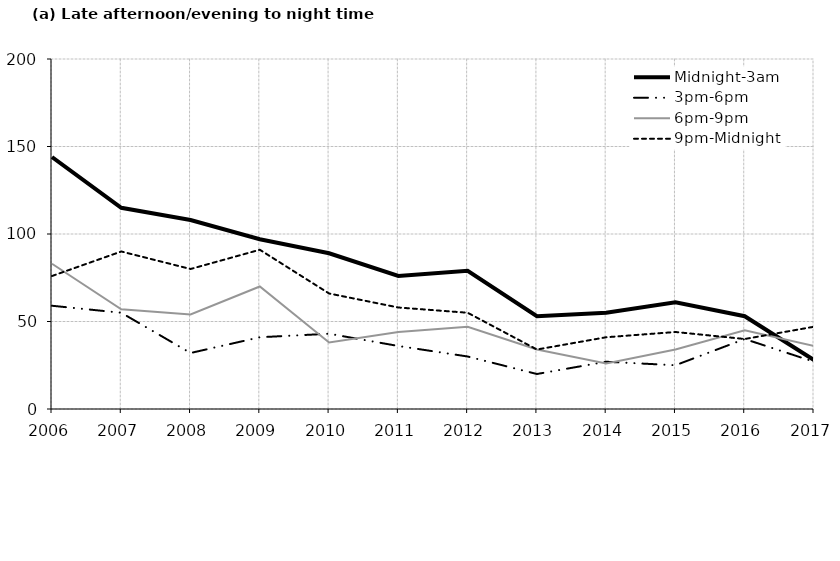
| Category | Midnight-3am | 3pm-6pm | 6pm-9pm | 9pm-Midnight |
|---|---|---|---|---|
| 2006.0 | 144 | 59 | 83 | 76 |
| 2007.0 | 115 | 55 | 57 | 90 |
| 2008.0 | 108 | 32 | 54 | 80 |
| 2009.0 | 97 | 41 | 70 | 91 |
| 2010.0 | 89 | 43 | 38 | 66 |
| 2011.0 | 76 | 36 | 44 | 58 |
| 2012.0 | 79 | 30 | 47 | 55 |
| 2013.0 | 53 | 20 | 34 | 34 |
| 2014.0 | 55 | 27 | 26 | 41 |
| 2015.0 | 61 | 25 | 34 | 44 |
| 2016.0 | 53 | 40 | 45 | 40 |
| 2017.0 | 28 | 27 | 36 | 47 |